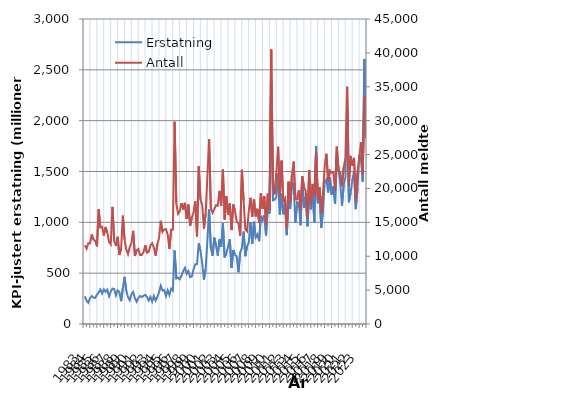
| Category | Erstatning |
|---|---|
| 1983.0 | 272.476 |
| nan | 228.241 |
| nan | 208.726 |
| nan | 255.681 |
| 1984.0 | 274.174 |
| nan | 259.349 |
| nan | 257.14 |
| nan | 287.612 |
| 1985.0 | 310.803 |
| nan | 339.716 |
| nan | 301.029 |
| nan | 341.407 |
| 1986.0 | 316.537 |
| nan | 338.708 |
| nan | 272.614 |
| nan | 319.021 |
| 1987.0 | 348.524 |
| nan | 343.929 |
| nan | 281.452 |
| nan | 331.136 |
| 1988.0 | 315.175 |
| nan | 224.671 |
| nan | 349.931 |
| nan | 463.561 |
| 1989.0 | 327.495 |
| nan | 264.694 |
| nan | 232.909 |
| nan | 293.841 |
| 1990.0 | 314.626 |
| nan | 253.117 |
| nan | 219.52 |
| nan | 255.514 |
| 1991.0 | 275.723 |
| nan | 265.107 |
| nan | 277.452 |
| nan | 286.851 |
| 1992.0 | 267.971 |
| nan | 230.899 |
| nan | 266.797 |
| nan | 220.161 |
| 1993.0 | 276.242 |
| nan | 229.895 |
| nan | 265.602 |
| nan | 314.216 |
| 1994.0 | 376.342 |
| nan | 329.008 |
| nan | 334.269 |
| nan | 275.52 |
| 1995.0 | 331.944 |
| nan | 285.571 |
| nan | 346.998 |
| nan | 329.458 |
| 1996.0 | 722.498 |
| nan | 447.383 |
| nan | 455.376 |
| nan | 439.174 |
| 1997.0 | 475.445 |
| nan | 521.72 |
| nan | 552.507 |
| nan | 492.964 |
| 1998.0 | 520.065 |
| nan | 460.728 |
| nan | 468.256 |
| nan | 538.207 |
| 1999.0 | 587.029 |
| nan | 589.881 |
| nan | 793.76 |
| nan | 718.854 |
| 2000.0 | 599.213 |
| nan | 435.16 |
| nan | 539.475 |
| nan | 822.533 |
| 2001.0 | 1128.833 |
| nan | 747.292 |
| nan | 671.167 |
| nan | 849.164 |
| 2002.0 | 773.381 |
| nan | 672.917 |
| nan | 831.61 |
| nan | 757.782 |
| 2003.0 | 991.075 |
| nan | 655.263 |
| nan | 697.116 |
| nan | 759.406 |
| 2004.0 | 833.109 |
| nan | 550.796 |
| nan | 728.174 |
| nan | 680.619 |
| 2005.0 | 666.159 |
| nan | 508.371 |
| nan | 705.758 |
| nan | 747.925 |
| 2006.0 | 909.116 |
| nan | 666.711 |
| nan | 767.133 |
| nan | 800.333 |
| 2007.0 | 1001.775 |
| nan | 787.607 |
| nan | 1006.3 |
| nan | 850.808 |
| 2008.0 | 879.846 |
| nan | 814.516 |
| nan | 1063.805 |
| nan | 1021.675 |
| 2009.0 | 1072.134 |
| nan | 870.402 |
| nan | 1149.778 |
| nan | 1086.781 |
| 2010.0 | 2383.957 |
| nan | 1215.936 |
| nan | 1221.786 |
| nan | 1249.939 |
| 2011.0 | 1477.199 |
| nan | 1074.184 |
| nan | 1280.8 |
| nan | 1079.412 |
| 2012.0 | 1195.841 |
| nan | 874.269 |
| nan | 1205.373 |
| nan | 1134.972 |
| 2013.0 | 1393.865 |
| nan | 1364.857 |
| nan | 993.133 |
| nan | 1199.588 |
| 2014.0 | 1183.117 |
| nan | 971.572 |
| nan | 1429.235 |
| nan | 1142.759 |
| 2015.0 | 1253.755 |
| nan | 960.156 |
| nan | 1270.973 |
| nan | 1128.478 |
| 2016.0 | 1297.274 |
| nan | 998.56 |
| nan | 1751.297 |
| nan | 1188.256 |
| 2017.0 | 1273.794 |
| nan | 944.741 |
| nan | 1115.75 |
| nan | 1393.201 |
| 2018.0 | 1422.258 |
| nan | 1293.875 |
| nan | 1442.223 |
| nan | 1272.463 |
| 2019.0 | 1353.561 |
| nan | 1180.207 |
| nan | 1642.585 |
| nan | 1529.706 |
| 2020.0 | 1383.022 |
| nan | 1161.735 |
| nan | 1370.806 |
| nan | 1441.417 |
| 2021.0 | 2124.65 |
| nan | 1196.984 |
| nan | 1287.798 |
| nan | 1419.598 |
| 2022.0 | 1497.826 |
| nan | 1130.117 |
| nan | 1331.624 |
| nan | 1662.34 |
| 2023.0 | 1619.101 |
| nan | 1398.508 |
| nan | 2605.878 |
| nan | 2067.13 |